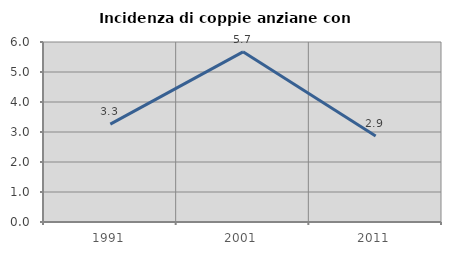
| Category | Incidenza di coppie anziane con figli |
|---|---|
| 1991.0 | 3.263 |
| 2001.0 | 5.672 |
| 2011.0 | 2.867 |